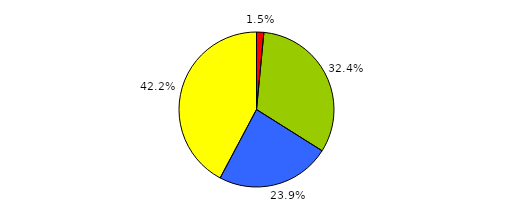
| Category | Series 0 |
|---|---|
| 0 | 16 |
| 1 | 340 |
| 2 | 250 |
| 3 | 443 |